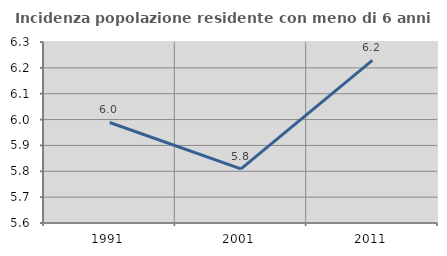
| Category | Incidenza popolazione residente con meno di 6 anni |
|---|---|
| 1991.0 | 5.989 |
| 2001.0 | 5.81 |
| 2011.0 | 6.229 |